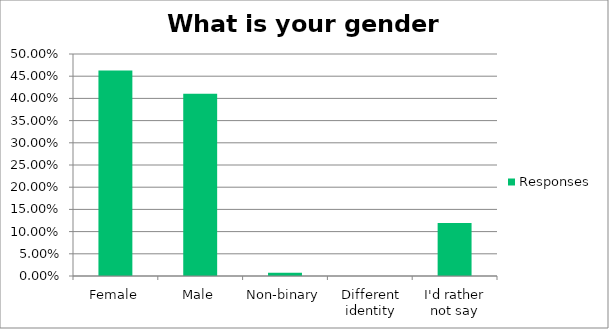
| Category | Responses |
|---|---|
| Female | 0.463 |
| Male | 0.41 |
| Non-binary | 0.008 |
| Different identity | 0 |
| I'd rather not say | 0.119 |